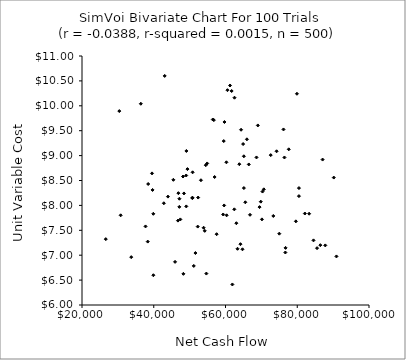
| Category | Series 0 |
|---|---|
| 48154.977217583066 | 8.58 |
| 70682.51596479409 | 8.323 |
| 86436.5420225312 | 7.201 |
| 66834.48184401443 | 7.811 |
| 77634.78412678391 | 9.126 |
| 61919.69156738762 | 6.412 |
| 70156.48960359007 | 7.719 |
| 90184.72702924711 | 8.559 |
| 47412.03063120171 | 7.719 |
| 47153.82297423416 | 8.134 |
| 70315.16078395753 | 8.278 |
| 54893.18877706429 | 8.843 |
| 59352.21812398874 | 7.818 |
| 43958.34105482556 | 8.176 |
| 57531.76421218569 | 7.422 |
| 33721.52515674997 | 6.961 |
| 39877.59826338139 | 7.831 |
| 56752.994389964195 | 9.713 |
| 72608.13298813373 | 9.01 |
| 38446.16943664757 | 8.429 |
| 60314.1827053593 | 7.801 |
| 69834.56499417181 | 8.075 |
| 64337.29943733051 | 9.519 |
| 47130.56907554706 | 7.97 |
| 38325.85133645695 | 7.273 |
| 54219.642747983875 | 7.489 |
| 48262.903444120406 | 6.625 |
| 63352.32465664006 | 7.129 |
| 60252.79794104138 | 8.866 |
| 76166.65208670945 | 9.525 |
| 76750.59733998531 | 7.147 |
| 69012.14545992219 | 9.606 |
| 79919.6168878054 | 10.241 |
| 62504.38922290401 | 10.162 |
| 65119.80775418579 | 8.986 |
| 61264.20784551128 | 10.408 |
| 30782.138242632733 | 7.801 |
| 51160.15559836281 | 6.784 |
| 43050.6036892064 | 10.6 |
| 39518.391990074204 | 8.643 |
| 54506.8366129497 | 8.808 |
| 49043.35357984937 | 8.6 |
| 90921.8678704726 | 6.975 |
| 74244.3059296348 | 9.087 |
| 37711.497301807656 | 7.578 |
| 53905.23708398311 | 7.551 |
| 82120.99361417707 | 7.837 |
| 65974.25845446187 | 9.327 |
| 52260.23134478972 | 7.575 |
| 26633.522325595914 | 7.322 |
| 66494.18093266759 | 8.822 |
| 83312.58172655286 | 7.833 |
| 59711.91548784729 | 9.675 |
| 50778.427713971025 | 8.156 |
| 52375.896013475955 | 8.157 |
| 59511.3111831608 | 9.292 |
| 30399.98168625337 | 9.894 |
| 50832.5745551164 | 8.664 |
| 56965.682830189384 | 8.57 |
| 75000.89940822551 | 7.432 |
| 36397.463767583315 | 10.041 |
| 64164.308127635755 | 7.221 |
| 53162.49106132139 | 8.505 |
| 76683.56462035289 | 7.054 |
| 80473.88928697901 | 8.348 |
| 84532.35526339684 | 7.298 |
| 46867.55294035408 | 8.246 |
| 39668.01394907492 | 8.31 |
| 69491.07617752672 | 7.966 |
| 48421.042627684474 | 8.24 |
| 59624.23058747544 | 7.999 |
| 45949.3432467028 | 6.866 |
| 42811.343717013704 | 8.043 |
| 85524.03185049415 | 7.141 |
| 56458.65201604321 | 9.725 |
| 61718.99473382138 | 10.297 |
| 45467.77841728845 | 8.514 |
| 64909.654327798096 | 9.232 |
| 49068.58371308889 | 7.98 |
| 63024.92257023466 | 7.642 |
| 76433.51148161334 | 8.962 |
| 51620.01489270308 | 7.044 |
| 39893.69821022398 | 6.598 |
| 62462.52936968756 | 7.921 |
| 79619.57845908559 | 7.68 |
| 87814.65117612609 | 7.197 |
| 54668.48657157927 | 6.631 |
| 65126.774458932865 | 8.348 |
| 63850.06819411562 | 8.827 |
| 46750.59939898617 | 7.694 |
| 87060.51842574339 | 8.92 |
| 80461.87214440771 | 8.187 |
| 50763.753905041885 | 8.146 |
| 49094.7505282223 | 9.093 |
| 68637.50571250387 | 8.963 |
| 64732.77941082179 | 7.119 |
| 73323.76729660372 | 7.788 |
| 49394.48321932916 | 8.729 |
| 60547.0956469481 | 10.314 |
| 65516.21868994972 | 8.063 |